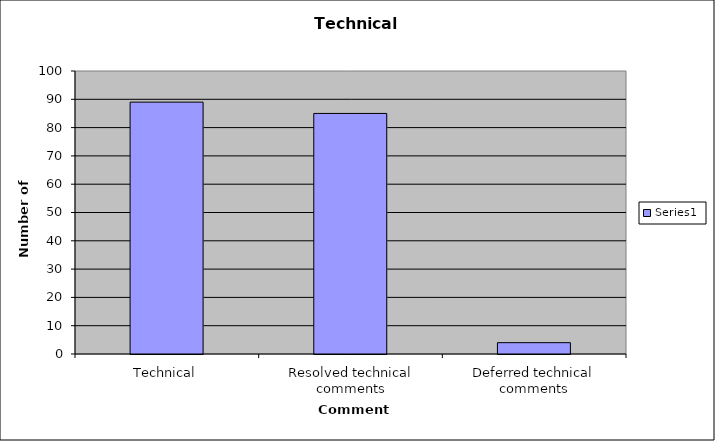
| Category | Series 0 |
|---|---|
| Technical | 89 |
| Resolved technical comments | 85 |
| Deferred technical comments | 4 |